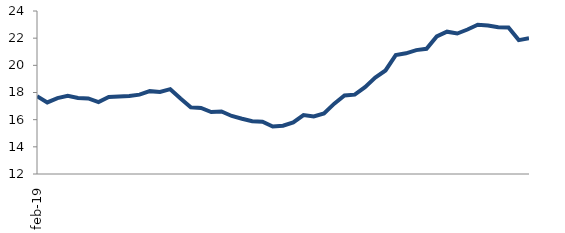
| Category | Series 0 |
|---|---|
| 2019-02-01 | 17.724 |
| 2019-03-01 | 17.269 |
| 2019-04-01 | 17.585 |
| 2019-05-01 | 17.752 |
| 2019-06-01 | 17.602 |
| 2019-07-01 | 17.56 |
| 2019-08-01 | 17.291 |
| 2019-09-01 | 17.666 |
| 2019-10-01 | 17.704 |
| 2019-11-01 | 17.747 |
| 2019-12-01 | 17.844 |
| 2020-01-01 | 18.099 |
| 2020-02-01 | 18.039 |
| 2020-03-01 | 18.244 |
| 2020-04-01 | 17.551 |
| 2020-05-01 | 16.911 |
| 2020-06-01 | 16.867 |
| 2020-07-01 | 16.563 |
| 2020-08-01 | 16.602 |
| 2020-09-01 | 16.272 |
| 2020-10-01 | 16.069 |
| 2020-11-01 | 15.889 |
| 2020-12-01 | 15.855 |
| 2021-01-01 | 15.501 |
| 2021-02-01 | 15.555 |
| 2021-03-01 | 15.803 |
| 2021-04-01 | 16.335 |
| 2021-05-01 | 16.232 |
| 2021-06-01 | 16.452 |
| 2021-07-01 | 17.177 |
| 2021-08-01 | 17.778 |
| 2021-09-01 | 17.842 |
| 2021-10-01 | 18.396 |
| 2021-11-01 | 19.101 |
| 2021-12-01 | 19.622 |
| 2022-01-01 | 20.759 |
| 2022-02-01 | 20.883 |
| 2022-03-01 | 21.119 |
| 2022-04-01 | 21.22 |
| 2022-05-01 | 22.124 |
| 2022-06-01 | 22.477 |
| 2022-07-01 | 22.34 |
| 2022-08-01 | 22.636 |
| 2022-09-01 | 22.99 |
| 2022-10-01 | 22.932 |
| 2022-11-01 | 22.799 |
| 2022-12-01 | 22.789 |
| 2023-01-01 | 21.858 |
| 2023-02-01 | 21.995 |